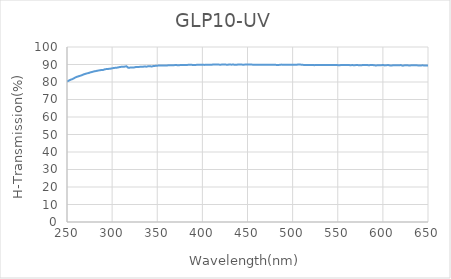
| Category | Series 0 |
|---|---|
| 200.0 | 0.002 |
| 202.0 | -94.737 |
| 204.0 | -330.769 |
| 206.0 | -26.471 |
| 208.0 | -34.94 |
| 210.0 | 37.067 |
| 212.0 | 58.076 |
| 214.0 | 60.244 |
| 216.0 | 62.694 |
| 218.0 | 64.337 |
| 220.0 | 66.002 |
| 222.0 | 67.57 |
| 224.0 | 68.974 |
| 226.0 | 70.198 |
| 228.0 | 71.369 |
| 230.0 | 72.551 |
| 232.0 | 73.603 |
| 234.0 | 74.593 |
| 236.0 | 75.614 |
| 238.0 | 76.486 |
| 240.0 | 77.03 |
| 242.0 | 77.778 |
| 244.0 | 78.477 |
| 246.0 | 79.008 |
| 248.0 | 79.79 |
| 250.0 | 80.352 |
| 252.0 | 80.777 |
| 254.0 | 81.3 |
| 256.0 | 81.652 |
| 258.0 | 82.22 |
| 260.0 | 82.774 |
| 262.0 | 83.133 |
| 264.0 | 83.467 |
| 266.0 | 83.807 |
| 268.0 | 84.239 |
| 270.0 | 84.601 |
| 272.0 | 84.908 |
| 274.0 | 85.141 |
| 276.0 | 85.51 |
| 278.0 | 85.779 |
| 280.0 | 86.059 |
| 282.0 | 86.252 |
| 284.0 | 86.475 |
| 286.0 | 86.667 |
| 288.0 | 86.846 |
| 290.0 | 86.896 |
| 292.0 | 87.257 |
| 294.0 | 87.406 |
| 296.0 | 87.494 |
| 298.0 | 87.617 |
| 300.0 | 87.813 |
| 302.0 | 88.011 |
| 304.0 | 88.136 |
| 306.0 | 88.24 |
| 308.0 | 88.505 |
| 310.0 | 88.66 |
| 312.0 | 88.68 |
| 314.0 | 88.791 |
| 316.0 | 88.968 |
| 318.0 | 88.077 |
| 320.0 | 88.262 |
| 322.0 | 88.278 |
| 324.0 | 88.245 |
| 326.0 | 88.546 |
| 328.0 | 88.563 |
| 330.0 | 88.633 |
| 332.0 | 88.678 |
| 334.0 | 88.701 |
| 336.0 | 88.882 |
| 338.0 | 88.751 |
| 340.0 | 88.994 |
| 342.0 | 88.993 |
| 344.0 | 88.877 |
| 346.0 | 89.159 |
| 348.0 | 89.218 |
| 350.0 | 89.321 |
| 352.0 | 89.426 |
| 354.0 | 89.39 |
| 356.0 | 89.415 |
| 358.0 | 89.363 |
| 360.0 | 89.385 |
| 362.0 | 89.532 |
| 364.0 | 89.571 |
| 366.0 | 89.581 |
| 368.0 | 89.586 |
| 370.0 | 89.677 |
| 372.0 | 89.634 |
| 374.0 | 89.602 |
| 376.0 | 89.692 |
| 378.0 | 89.692 |
| 380.0 | 89.753 |
| 382.0 | 89.677 |
| 384.0 | 89.796 |
| 386.0 | 89.855 |
| 388.0 | 89.844 |
| 390.0 | 89.668 |
| 392.0 | 89.74 |
| 394.0 | 89.807 |
| 396.0 | 89.873 |
| 398.0 | 89.817 |
| 400.0 | 89.856 |
| 402.0 | 89.78 |
| 404.0 | 89.826 |
| 406.0 | 89.899 |
| 408.0 | 89.862 |
| 410.0 | 89.833 |
| 412.0 | 90.001 |
| 414.0 | 89.963 |
| 416.0 | 89.95 |
| 418.0 | 89.944 |
| 420.0 | 89.9 |
| 422.0 | 89.965 |
| 424.0 | 89.963 |
| 426.0 | 89.934 |
| 428.0 | 89.871 |
| 430.0 | 90.026 |
| 432.0 | 89.911 |
| 434.0 | 89.978 |
| 436.0 | 89.86 |
| 438.0 | 89.907 |
| 440.0 | 89.957 |
| 442.0 | 89.968 |
| 444.0 | 89.931 |
| 446.0 | 89.904 |
| 448.0 | 89.983 |
| 450.0 | 90.027 |
| 452.0 | 90.024 |
| 454.0 | 89.988 |
| 456.0 | 89.895 |
| 458.0 | 89.886 |
| 460.0 | 89.926 |
| 462.0 | 89.91 |
| 464.0 | 89.869 |
| 466.0 | 89.892 |
| 468.0 | 89.907 |
| 470.0 | 89.886 |
| 472.0 | 89.922 |
| 474.0 | 89.858 |
| 476.0 | 89.802 |
| 478.0 | 89.918 |
| 480.0 | 89.862 |
| 482.0 | 89.767 |
| 484.0 | 89.739 |
| 486.0 | 89.826 |
| 488.0 | 89.937 |
| 490.0 | 89.792 |
| 492.0 | 89.881 |
| 494.0 | 89.81 |
| 496.0 | 89.831 |
| 498.0 | 89.794 |
| 500.0 | 89.878 |
| 502.0 | 89.865 |
| 504.0 | 89.867 |
| 506.0 | 89.967 |
| 508.0 | 90.038 |
| 510.0 | 89.812 |
| 512.0 | 89.782 |
| 514.0 | 89.69 |
| 516.0 | 89.71 |
| 518.0 | 89.705 |
| 520.0 | 89.735 |
| 522.0 | 89.726 |
| 524.0 | 89.624 |
| 526.0 | 89.74 |
| 528.0 | 89.771 |
| 530.0 | 89.665 |
| 532.0 | 89.654 |
| 534.0 | 89.679 |
| 536.0 | 89.772 |
| 538.0 | 89.705 |
| 540.0 | 89.65 |
| 542.0 | 89.669 |
| 544.0 | 89.731 |
| 546.0 | 89.655 |
| 548.0 | 89.732 |
| 550.0 | 89.635 |
| 552.0 | 89.567 |
| 554.0 | 89.748 |
| 556.0 | 89.733 |
| 558.0 | 89.73 |
| 560.0 | 89.71 |
| 562.0 | 89.757 |
| 564.0 | 89.555 |
| 566.0 | 89.691 |
| 568.0 | 89.564 |
| 570.0 | 89.657 |
| 572.0 | 89.658 |
| 574.0 | 89.585 |
| 576.0 | 89.551 |
| 578.0 | 89.728 |
| 580.0 | 89.755 |
| 582.0 | 89.771 |
| 584.0 | 89.585 |
| 586.0 | 89.658 |
| 588.0 | 89.693 |
| 590.0 | 89.618 |
| 592.0 | 89.465 |
| 594.0 | 89.528 |
| 596.0 | 89.591 |
| 598.0 | 89.573 |
| 600.0 | 89.743 |
| 602.0 | 89.486 |
| 604.0 | 89.578 |
| 606.0 | 89.697 |
| 608.0 | 89.438 |
| 610.0 | 89.457 |
| 612.0 | 89.621 |
| 614.0 | 89.529 |
| 616.0 | 89.582 |
| 618.0 | 89.601 |
| 620.0 | 89.644 |
| 622.0 | 89.326 |
| 624.0 | 89.533 |
| 626.0 | 89.608 |
| 628.0 | 89.501 |
| 630.0 | 89.435 |
| 632.0 | 89.635 |
| 634.0 | 89.504 |
| 636.0 | 89.532 |
| 638.0 | 89.517 |
| 640.0 | 89.386 |
| 642.0 | 89.457 |
| 644.0 | 89.522 |
| 646.0 | 89.459 |
| 648.0 | 89.483 |
| 650.0 | 89.456 |